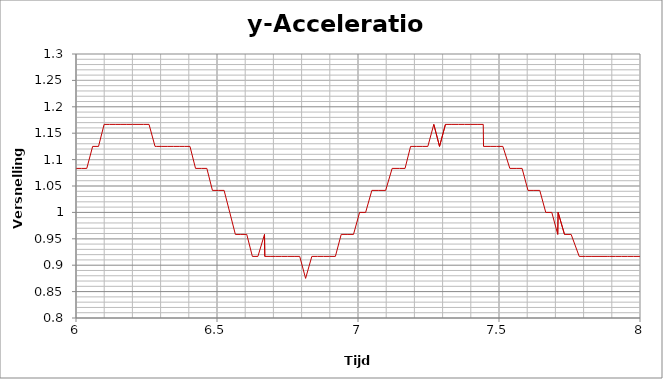
| Category |  y-Acceleration |
|---|---|
| 0.0002662 | 0.958 |
| 0.060613 | 0.958 |
| 0.0614756 | 0.958 |
| 0.0623199 | 0.958 |
| 0.0631661 | 0.958 |
| 0.0640148 | 0.958 |
| 0.0648724 | 0.958 |
| 0.0657192 | 0.958 |
| 0.0665637 | 0.958 |
| 0.0674161 | 0.958 |
| 0.0682692 | 0.958 |
| 0.0691174 | 0.958 |
| 0.0751866 | 0.958 |
| 0.0816187 | 1 |
| 0.1481199 | 0.958 |
| 0.1490641 | 0.958 |
| 0.150012 | 0.958 |
| 0.1508702 | 0.958 |
| 0.1517765 | 0.958 |
| 0.1526677 | 0.958 |
| 0.1760877 | 0.958 |
| 0.1770878 | 0.958 |
| 0.1782304 | 0.958 |
| 0.2018376 | 0.958 |
| 0.2028634 | 0.958 |
| 0.2271168 | 0.958 |
| 0.2281415 | 0.958 |
| 0.2370343 | 0.958 |
| 0.2382185 | 0.958 |
| 0.2612278 | 0.958 |
| 0.2621643 | 0.958 |
| 0.2864827 | 0.958 |
| 0.2874689 | 0.958 |
| 0.3031784 | 0.958 |
| 0.3038171 | 0.958 |
| 0.3189757 | 0.958 |
| 0.3196548 | 0.958 |
| 0.3350735 | 0.958 |
| 0.3363276 | 0.958 |
| 0.3520145 | 0.958 |
| 0.3672919 | 0.958 |
| 0.3679531 | 0.958 |
| 0.3822837 | 0.958 |
| 0.4009889 | 0.958 |
| 0.4160143 | 0.958 |
| 0.4166021 | 0.958 |
| 0.4320577 | 0.958 |
| 0.4475096 | 0.958 |
| 0.462454 | 0.958 |
| 0.4631152 | 0.958 |
| 0.4666822 | 0.958 |
| 0.4851773 | 0.958 |
| 0.4894834 | 0.958 |
| 0.5040216 | 0.958 |
| 0.5250323 | 1 |
| 0.5256603 | 1 |
| 0.5456363 | 0.958 |
| 0.5462364 | 0.958 |
| 0.5664823 | 1 |
| 0.5671653 | 1 |
| 0.5829726 | 0.958 |
| 0.5838985 | 0.958 |
| 0.6104471 | 0.958 |
| 0.6259898 | 0.958 |
| 0.6410219 | 0.958 |
| 0.6416885 | 0.958 |
| 0.6565502 | 0.958 |
| 0.6719764 | 0.958 |
| 0.6729011 | 0.958 |
| 0.6885319 | 0.958 |
| 0.7038648 | 0.958 |
| 0.7187812 | 1 |
| 0.7342729 | 0.958 |
| 0.7349506 | 0.958 |
| 0.7502098 | 0.958 |
| 0.7659669 | 0.958 |
| 0.7666024 | 0.958 |
| 0.8034565 | 0.958 |
| 0.8181654 | 1 |
| 0.8332226 | 0.958 |
| 0.8338515 | 0.958 |
| 0.8501524 | 0.958 |
| 0.8695783 | 0.958 |
| 0.8702673 | 0.958 |
| 0.9005879 | 1 |
| 0.9166332 | 0.958 |
| 0.9319072 | 0.958 |
| 0.9325106 | 0.958 |
| 0.9480411 | 0.958 |
| 0.9630584 | 0.958 |
| 0.9895187 | 0.958 |
| 1.006163 | 0.958 |
| 1.022612 | 0.958 |
| 1.03846 | 0.958 |
| 1.039092 | 0.958 |
| 1.054976 | 0.958 |
| 1.055839 | 0.958 |
| 1.071572 | 0.958 |
| 1.087707 | 1 |
| 1.088382 | 1 |
| 1.103901 | 1 |
| 1.119415 | 1.042 |
| 1.120099 | 1.042 |
| 1.136007 | 1 |
| 1.151418 | 1 |
| 1.177456 | 0.917 |
| 1.194921 | 0.875 |
| 1.195565 | 0.875 |
| 1.211279 | 0.833 |
| 1.211902 | 0.833 |
| 1.227909 | 1 |
| 1.228593 | 1 |
| 1.244789 | 1.125 |
| 1.261335 | 1.25 |
| 1.261897 | 1.25 |
| 1.276201 | 1.125 |
| 1.290843 | 0.875 |
| 1.291464 | 0.875 |
| 1.308035 | 0.833 |
| 1.323457 | 0.75 |
| 1.324118 | 0.75 |
| 1.33941 | 0.75 |
| 1.353974 | 0.75 |
| 1.369141 | 0.917 |
| 1.370163 | 0.917 |
| 1.385505 | 1.208 |
| 1.38608 | 1.208 |
| 1.404469 | 1.292 |
| 1.419612 | 1.333 |
| 1.420258 | 1.333 |
| 1.434877 | 1.25 |
| 1.450562 | 1.042 |
| 1.451181 | 1.042 |
| 1.466477 | 0.917 |
| 1.467086 | 0.917 |
| 1.482276 | 0.917 |
| 1.496969 | 0.917 |
| 1.497595 | 0.917 |
| 1.515008 | 0.958 |
| 1.530838 | 1.083 |
| 1.53149 | 1.083 |
| 1.557654 | 1.292 |
| 1.558419 | 1.292 |
| 1.558891 | 1.292 |
| 1.573972 | 1.292 |
| 1.589168 | 1.292 |
| 1.606048 | 1.25 |
| 1.606592 | 1.25 |
| 1.621485 | 1.208 |
| 1.6221 | 1.208 |
| 1.636641 | 1.167 |
| 1.651987 | 1.125 |
| 1.652547 | 1.125 |
| 1.667626 | 1.125 |
| 1.685046 | 1.208 |
| 1.686537 | 1.208 |
| 1.701227 | 1.333 |
| 1.701863 | 1.333 |
| 1.717252 | 1.333 |
| 1.733063 | 1.292 |
| 1.733733 | 1.292 |
| 1.748847 | 1.25 |
| 1.749599 | 1.208 |
| 1.764987 | 1.167 |
| 1.780498 | 1.083 |
| 1.781357 | 1.083 |
| 1.796076 | 1.083 |
| 1.810921 | 1.083 |
| 1.811683 | 1.083 |
| 1.827557 | 1.125 |
| 1.843878 | 1.208 |
| 1.84449 | 1.208 |
| 1.861412 | 1.25 |
| 1.879037 | 1.25 |
| 1.879667 | 1.25 |
| 1.894675 | 1.208 |
| 1.911403 | 1.167 |
| 1.911978 | 1.167 |
| 1.927106 | 1.167 |
| 1.927899 | 1.167 |
| 1.976432 | 1.042 |
| 1.977043 | 1.042 |
| 1.977532 | 1.042 |
| 1.978008 | 1.042 |
| 1.978498 | 1.042 |
| 1.992973 | 1.083 |
| 2.010069 | 1.125 |
| 2.010691 | 1.125 |
| 2.026174 | 1.125 |
| 2.026886 | 1.042 |
| 2.043105 | 1 |
| 2.059834 | 0.958 |
| 2.060908 | 0.958 |
| 2.075981 | 0.875 |
| 2.076623 | 0.875 |
| 2.091663 | 0.833 |
| 2.108044 | 0.833 |
| 2.108691 | 0.833 |
| 2.124262 | 0.833 |
| 2.143529 | 0.958 |
| 2.144132 | 0.958 |
| 2.158699 | 1 |
| 2.173671 | 1.042 |
| 2.174269 | 1.042 |
| 2.188814 | 1 |
| 2.205269 | 0.958 |
| 2.205843 | 0.958 |
| 2.221688 | 0.875 |
| 2.222244 | 0.875 |
| 2.237794 | 0.875 |
| 2.254113 | 0.792 |
| 2.254708 | 0.792 |
| 2.270574 | 0.833 |
| 2.286343 | 0.875 |
| 2.286921 | 0.875 |
| 2.302702 | 0.958 |
| 2.303376 | 0.958 |
| 2.319743 | 1 |
| 2.320693 | 1 |
| 2.33595 | 0.958 |
| 2.352243 | 0.917 |
| 2.35287 | 0.917 |
| 2.368848 | 0.917 |
| 2.385015 | 0.833 |
| 2.385627 | 0.833 |
| 2.40074 | 0.75 |
| 2.417503 | 0.75 |
| 2.418159 | 0.75 |
| 2.43529 | 0.833 |
| 2.435873 | 0.833 |
| 2.452403 | 0.917 |
| 2.468724 | 1.042 |
| 2.46929 | 1.042 |
| 2.486563 | 1.125 |
| 2.487219 | 1.125 |
| 2.502594 | 1.125 |
| 2.517827 | 1.083 |
| 2.518496 | 1.083 |
| 2.533627 | 1.042 |
| 2.550041 | 0.958 |
| 2.550731 | 0.958 |
| 2.566839 | 0.958 |
| 2.567503 | 0.958 |
| 2.582572 | 1 |
| 2.599814 | 1.083 |
| 2.600521 | 1.083 |
| 2.616426 | 1.125 |
| 2.6319 | 1.208 |
| 2.63258 | 1.208 |
| 2.648348 | 1.208 |
| 2.666164 | 1.167 |
| 2.666868 | 1.167 |
| 2.667571 | 1.125 |
| 2.683593 | 1.083 |
| 2.699468 | 1.042 |
| 2.700149 | 1.042 |
| 2.716404 | 1.042 |
| 2.732803 | 1.042 |
| 2.751235 | 1.125 |
| 2.751822 | 1.125 |
| 2.7525 | 1.167 |
| 2.769033 | 1.208 |
| 2.785805 | 1.292 |
| 2.786473 | 1.292 |
| 2.802499 | 1.333 |
| 2.818516 | 1.333 |
| 2.819093 | 1.333 |
| 2.872499 | 1.167 |
| 2.873155 | 1.167 |
| 2.873663 | 1.167 |
| 2.874172 | 1.167 |
| 2.874671 | 1.167 |
| 2.891077 | 1.167 |
| 2.891849 | 1.167 |
| 2.908446 | 1.208 |
| 2.909124 | 1.208 |
| 2.925903 | 1.25 |
| 2.926483 | 1.25 |
| 2.943396 | 1.208 |
| 2.943979 | 1.208 |
| 2.959762 | 1.208 |
| 2.975782 | 1.167 |
| 2.991867 | 1.083 |
| 2.992551 | 1.083 |
| 3.010469 | 1.083 |
| 3.025869 | 1.083 |
| 3.026557 | 1.083 |
| 3.042338 | 1.083 |
| 3.04301 | 1.083 |
| 3.058511 | 1.083 |
| 3.075442 | 1.167 |
| 3.076032 | 1.167 |
| 3.076734 | 1.167 |
| 3.09311 | 1.167 |
| 3.109627 | 1.125 |
| 3.110318 | 1.125 |
| 3.125886 | 1.083 |
| 3.141529 | 1.042 |
| 3.157346 | 1.042 |
| 3.158025 | 1.042 |
| 3.175215 | 0.958 |
| 3.175812 | 0.958 |
| 3.19338 | 0.958 |
| 3.195297 | 0.958 |
| 3.212076 | 0.958 |
| 3.212935 | 1 |
| 3.229846 | 1 |
| 3.230652 | 0.958 |
| 3.254457 | 0.958 |
| 3.270894 | 0.917 |
| 3.271729 | 0.917 |
| 3.272538 | 0.917 |
| 3.289592 | 0.917 |
| 3.290507 | 0.875 |
| 3.307485 | 0.875 |
| 3.324757 | 0.875 |
| 3.325544 | 0.875 |
| 3.342966 | 0.875 |
| 3.359819 | 0.917 |
| 3.361213 | 0.917 |
| 3.378363 | 0.917 |
| 3.379014 | 0.917 |
| 3.398633 | 0.917 |
| 3.417824 | 0.917 |
| 3.418486 | 0.917 |
| 3.419003 | 0.917 |
| 3.435381 | 0.875 |
| 3.435973 | 0.875 |
| 3.452818 | 0.875 |
| 3.469825 | 0.875 |
| 3.470546 | 0.875 |
| 3.487113 | 0.917 |
| 3.487815 | 0.917 |
| 3.505697 | 0.917 |
| 3.524318 | 0.917 |
| 3.525009 | 0.917 |
| 3.542207 | 0.875 |
| 3.542815 | 0.875 |
| 3.559146 | 0.875 |
| 3.561226 | 0.875 |
| 3.579415 | 0.875 |
| 3.596549 | 0.958 |
| 3.597263 | 0.958 |
| 3.614834 | 1 |
| 3.615488 | 1 |
| 3.616024 | 1 |
| 3.634102 | 1.042 |
| 3.651154 | 1.042 |
| 3.651788 | 1.042 |
| 3.67118 | 1.042 |
| 3.67205 | 1.042 |
| 3.691441 | 1.042 |
| 3.692117 | 1.042 |
| 3.716378 | 1.083 |
| 3.717102 | 1.083 |
| 3.717771 | 1.083 |
| 3.73671 | 1.083 |
| 3.754626 | 1.083 |
| 3.755738 | 1.083 |
| 3.77505 | 1.125 |
| 3.775661 | 1.125 |
| 3.793215 | 1.125 |
| 3.793836 | 1.125 |
| 3.811444 | 1.125 |
| 3.81208 | 1.125 |
| 3.82942 | 1.125 |
| 3.830263 | 1.125 |
| 3.848629 | 1.125 |
| 3.868261 | 1.167 |
| 3.868866 | 1.167 |
| 3.888633 | 1.167 |
| 3.889239 | 1.167 |
| 3.910725 | 1.208 |
| 3.911354 | 1.208 |
| 3.930367 | 1.25 |
| 3.931115 | 1.25 |
| 3.931696 | 1.25 |
| 3.94862 | 1.208 |
| 3.966797 | 1.208 |
| 3.967461 | 1.208 |
| 3.984741 | 1.208 |
| 4.001652 | 1.208 |
| 4.002263 | 1.208 |
| 4.021482 | 1.167 |
| 4.022092 | 1.167 |
| 4.039127 | 1.167 |
| 4.039734 | 1.167 |
| 4.056654 | 1.167 |
| 4.057257 | 1.167 |
| 4.074796 | 1.125 |
| 4.075412 | 1.125 |
| 4.094442 | 1.125 |
| 4.114367 | 1.125 |
| 4.114979 | 1.125 |
| 4.136014 | 1.125 |
| 4.136662 | 1.125 |
| 4.137188 | 1.125 |
| 4.157012 | 1.125 |
| 4.157799 | 1.125 |
| 4.180805 | 1.125 |
| 4.199557 | 1.083 |
| 4.200227 | 1.083 |
| 4.200783 | 1.083 |
| 4.219336 | 1.083 |
| 4.220038 | 1.083 |
| 4.238477 | 1.083 |
| 4.239399 | 1.083 |
| 4.255874 | 1.083 |
| 4.273692 | 1.042 |
| 4.275841 | 1.042 |
| 4.294923 | 1 |
| 4.295534 | 1 |
| 4.312841 | 0.958 |
| 4.333052 | 0.958 |
| 4.333668 | 0.958 |
| 4.334204 | 0.958 |
| 4.35188 | 0.917 |
| 4.352506 | 0.917 |
| 4.370719 | 0.917 |
| 4.39007 | 0.917 |
| 4.390913 | 0.958 |
| 4.391473 | 0.958 |
| 4.411549 | 0.917 |
| 4.432093 | 0.917 |
| 4.432872 | 0.917 |
| 4.450951 | 0.917 |
| 4.451829 | 0.917 |
| 4.452538 | 0.917 |
| 4.471237 | 0.917 |
| 4.488688 | 0.875 |
| 4.489323 | 0.875 |
| 4.50632 | 0.917 |
| 4.507215 | 0.875 |
| 4.52534 | 0.917 |
| 4.526058 | 0.917 |
| 4.545467 | 0.875 |
| 4.562277 | 0.917 |
| 4.562996 | 0.917 |
| 4.580622 | 0.917 |
| 4.58131 | 0.917 |
| 4.600426 | 0.917 |
| 4.618572 | 0.875 |
| 4.619329 | 0.875 |
| 4.638745 | 0.875 |
| 4.657476 | 0.917 |
| 4.658124 | 0.917 |
| 4.677011 | 0.917 |
| 4.677647 | 0.917 |
| 4.695756 | 0.958 |
| 4.696397 | 0.958 |
| 4.714896 | 1 |
| 4.715533 | 1 |
| 4.733857 | 1 |
| 4.734567 | 1 |
| 4.753572 | 1.042 |
| 4.754201 | 1.042 |
| 4.773886 | 1 |
| 4.774528 | 1 |
| 4.793826 | 1.042 |
| 4.794457 | 1.042 |
| 4.81465 | 1.042 |
| 4.815291 | 1.042 |
| 4.834771 | 1.042 |
| 4.835478 | 1.042 |
| 4.855644 | 1.042 |
| 4.856471 | 1.042 |
| 4.875498 | 1.083 |
| 4.87616 | 1.083 |
| 4.893731 | 1.083 |
| 4.894454 | 1.083 |
| 4.91176 | 1.083 |
| 4.930867 | 1.125 |
| 4.931514 | 1.125 |
| 4.949513 | 1.125 |
| 4.950244 | 1.125 |
| 4.968587 | 1.167 |
| 4.96931 | 1.167 |
| 4.987575 | 1.167 |
| 4.98828 | 1.167 |
| 5.007565 | 1.208 |
| 5.008242 | 1.208 |
| 5.028056 | 1.208 |
| 5.028913 | 1.208 |
| 5.04611 | 1.208 |
| 5.064214 | 1.208 |
| 5.064933 | 1.208 |
| 5.082254 | 1.167 |
| 5.082932 | 1.167 |
| 5.100035 | 1.167 |
| 5.10078 | 1.167 |
| 5.118546 | 1.125 |
| 5.119197 | 1.125 |
| 5.138031 | 1.167 |
| 5.138741 | 1.167 |
| 5.158171 | 1.125 |
| 5.177094 | 1.125 |
| 5.17777 | 1.125 |
| 5.196535 | 1.125 |
| 5.197258 | 1.125 |
| 5.214845 | 1.167 |
| 5.215663 | 1.167 |
| 5.234885 | 1.125 |
| 5.23557 | 1.125 |
| 5.255137 | 1.125 |
| 5.255782 | 1.125 |
| 5.275614 | 1.125 |
| 5.27629 | 1.125 |
| 5.297902 | 1.083 |
| 5.29855 | 1.083 |
| 5.318673 | 1.083 |
| 5.319317 | 1.083 |
| 5.341199 | 1.083 |
| 5.341964 | 1.042 |
| 5.342524 | 1.042 |
| 5.362966 | 1.042 |
| 5.384017 | 1.042 |
| 5.384674 | 1.042 |
| 5.385231 | 1.042 |
| 5.405904 | 0.958 |
| 5.406559 | 0.958 |
| 5.427012 | 1 |
| 5.427732 | 1 |
| 5.445395 | 0.958 |
| 5.446513 | 0.958 |
| 5.463916 | 0.958 |
| 5.481521 | 0.958 |
| 5.482263 | 0.958 |
| 5.499962 | 0.958 |
| 5.500607 | 0.958 |
| 5.521568 | 0.958 |
| 5.522213 | 0.958 |
| 5.542115 | 0.917 |
| 5.542764 | 0.917 |
| 5.564919 | 0.917 |
| 5.565678 | 0.917 |
| 5.566242 | 0.917 |
| 5.586475 | 0.917 |
| 5.606754 | 0.917 |
| 5.607428 | 0.917 |
| 5.626393 | 0.917 |
| 5.627048 | 0.917 |
| 5.62792 | 0.917 |
| 5.649092 | 0.917 |
| 5.677835 | 0.875 |
| 5.678818 | 0.875 |
| 5.679666 | 0.875 |
| 5.697974 | 0.917 |
| 5.698693 | 0.917 |
| 5.716976 | 0.875 |
| 5.717714 | 0.875 |
| 5.736117 | 0.917 |
| 5.736897 | 0.917 |
| 5.755868 | 0.917 |
| 5.756614 | 0.917 |
| 5.775803 | 0.958 |
| 5.776739 | 0.958 |
| 5.795527 | 0.958 |
| 5.796308 | 0.958 |
| 5.81497 | 0.958 |
| 5.815629 | 0.958 |
| 5.835294 | 0.958 |
| 5.835983 | 0.958 |
| 5.870345 | 0.958 |
| 5.871287 | 0.958 |
| 5.871933 | 1 |
| 5.872715 | 1 |
| 5.89613 | 1 |
| 5.89692 | 1 |
| 5.916994 | 1 |
| 5.918079 | 1 |
| 5.937619 | 1.042 |
| 5.938279 | 1.042 |
| 5.95926 | 1.042 |
| 5.959964 | 1.042 |
| 5.980758 | 1.042 |
| 5.981452 | 1.042 |
| 5.999629 | 1.083 |
| 6.000379 | 1.083 |
| 6.018971 | 1.083 |
| 6.020279 | 1.083 |
| 6.038286 | 1.083 |
| 6.039063 | 1.083 |
| 6.059027 | 1.125 |
| 6.059917 | 1.125 |
| 6.079843 | 1.125 |
| 6.0806 | 1.125 |
| 6.099723 | 1.167 |
| 6.100475 | 1.167 |
| 6.119243 | 1.167 |
| 6.120039 | 1.167 |
| 6.139014 | 1.167 |
| 6.139864 | 1.167 |
| 6.159259 | 1.167 |
| 6.15992 | 1.167 |
| 6.180265 | 1.167 |
| 6.180959 | 1.167 |
| 6.200109 | 1.167 |
| 6.219884 | 1.167 |
| 6.22059 | 1.167 |
| 6.239026 | 1.167 |
| 6.259012 | 1.167 |
| 6.280241 | 1.125 |
| 6.280997 | 1.125 |
| 6.284644 | 1.125 |
| 6.304255 | 1.125 |
| 6.306303 | 1.125 |
| 6.325403 | 1.125 |
| 6.326072 | 1.125 |
| 6.346319 | 1.125 |
| 6.347612 | 1.125 |
| 6.366124 | 1.125 |
| 6.366875 | 1.125 |
| 6.385231 | 1.125 |
| 6.38599 | 1.125 |
| 6.40419 | 1.125 |
| 6.423825 | 1.083 |
| 6.424738 | 1.083 |
| 6.425336 | 1.083 |
| 6.444478 | 1.083 |
| 6.445549 | 1.083 |
| 6.464008 | 1.083 |
| 6.483772 | 1.042 |
| 6.48448 | 1.042 |
| 6.504388 | 1.042 |
| 6.505153 | 1.042 |
| 6.505746 | 1.042 |
| 6.525165 | 1.042 |
| 6.545268 | 1 |
| 6.546043 | 1 |
| 6.546627 | 1 |
| 6.565144 | 0.958 |
| 6.584456 | 0.958 |
| 6.585169 | 0.958 |
| 6.605523 | 0.958 |
| 6.606302 | 0.958 |
| 6.606977 | 0.958 |
| 6.625432 | 0.917 |
| 6.645076 | 0.917 |
| 6.646483 | 0.917 |
| 6.647084 | 0.917 |
| 6.668478 | 0.958 |
| 6.669513 | 0.917 |
| 6.688247 | 0.917 |
| 6.708448 | 0.917 |
| 6.709533 | 0.917 |
| 6.710251 | 0.917 |
| 6.729266 | 0.917 |
| 6.750484 | 0.917 |
| 6.751229 | 0.917 |
| 6.75182 | 0.917 |
| 6.773431 | 0.917 |
| 6.774105 | 0.917 |
| 6.793341 | 0.917 |
| 6.814166 | 0.875 |
| 6.815402 | 0.875 |
| 6.816128 | 0.875 |
| 6.836314 | 0.917 |
| 6.837007 | 0.917 |
| 6.856794 | 0.917 |
| 6.857612 | 0.917 |
| 6.877659 | 0.917 |
| 6.878879 | 0.917 |
| 6.898581 | 0.917 |
| 6.899358 | 0.917 |
| 6.919789 | 0.917 |
| 6.920567 | 0.917 |
| 6.940457 | 0.958 |
| 6.941144 | 0.958 |
| 6.961349 | 0.958 |
| 6.962128 | 0.958 |
| 6.984097 | 0.958 |
| 6.984905 | 0.958 |
| 6.985513 | 0.958 |
| 7.005632 | 1 |
| 7.006435 | 1 |
| 7.02705 | 1 |
| 7.049135 | 1.042 |
| 7.049828 | 1.042 |
| 7.050424 | 1.042 |
| 7.073669 | 1.042 |
| 7.074385 | 1.042 |
| 7.098041 | 1.042 |
| 7.098892 | 1.042 |
| 7.099532 | 1.042 |
| 7.121077 | 1.083 |
| 7.122627 | 1.083 |
| 7.146601 | 1.083 |
| 7.147666 | 1.083 |
| 7.166885 | 1.083 |
| 7.167658 | 1.083 |
| 7.186472 | 1.125 |
| 7.187257 | 1.125 |
| 7.206549 | 1.125 |
| 7.207531 | 1.125 |
| 7.208168 | 1.125 |
| 7.227958 | 1.125 |
| 7.247718 | 1.125 |
| 7.248511 | 1.125 |
| 7.268793 | 1.167 |
| 7.269585 | 1.167 |
| 7.289125 | 1.125 |
| 7.2899 | 1.125 |
| 7.310102 | 1.167 |
| 7.311285 | 1.167 |
| 7.311884 | 1.167 |
| 7.333024 | 1.167 |
| 7.33372 | 1.167 |
| 7.356527 | 1.167 |
| 7.357221 | 1.167 |
| 7.377576 | 1.167 |
| 7.378298 | 1.167 |
| 7.400278 | 1.167 |
| 7.40097 | 1.167 |
| 7.422299 | 1.167 |
| 7.423128 | 1.167 |
| 7.444147 | 1.167 |
| 7.445107 | 1.125 |
| 7.445715 | 1.125 |
| 7.471079 | 1.125 |
| 7.472188 | 1.125 |
| 7.491728 | 1.125 |
| 7.492427 | 1.125 |
| 7.51371 | 1.125 |
| 7.514395 | 1.125 |
| 7.538404 | 1.083 |
| 7.539196 | 1.083 |
| 7.540057 | 1.083 |
| 7.560894 | 1.083 |
| 7.561934 | 1.083 |
| 7.581856 | 1.083 |
| 7.582654 | 1.083 |
| 7.602819 | 1.042 |
| 7.603755 | 1.042 |
| 7.623708 | 1.042 |
| 7.624461 | 1.042 |
| 7.644605 | 1.042 |
| 7.645391 | 1.042 |
| 7.665795 | 1 |
| 7.666569 | 1 |
| 7.687225 | 1 |
| 7.68801 | 1 |
| 7.708309 | 0.958 |
| 7.709623 | 1 |
| 7.710277 | 1 |
| 7.732236 | 0.958 |
| 7.732947 | 0.958 |
| 7.755853 | 0.958 |
| 7.756855 | 0.958 |
| 7.784441 | 0.917 |
| 7.785135 | 0.917 |
| 7.785745 | 0.917 |
| 7.807374 | 0.917 |
| 7.808119 | 0.917 |
| 7.829374 | 0.917 |
| 7.8301 | 0.917 |
| 7.885962 | 0.917 |
| 7.886787 | 0.917 |
| 7.887866 | 0.917 |
| 7.888498 | 0.917 |
| 7.890811 | 0.917 |
| 7.891554 | 0.917 |
| 7.912533 | 0.917 |
| 7.913322 | 0.917 |
| 7.934786 | 0.917 |
| 7.935487 | 0.917 |
| 7.936534 | 0.917 |
| 7.956103 | 0.917 |
| 7.956913 | 0.917 |
| 7.977138 | 0.917 |
| 7.977895 | 0.917 |
| 7.999568 | 0.917 |
| 8.000631 | 0.917 |
| 8.021871 | 0.917 |
| 8.022669 | 0.917 |
| 8.04732 | 0.917 |
| 8.048056 | 0.917 |
| 8.049393 | 0.958 |
| 8.071186 | 0.958 |
| 8.071987 | 0.958 |
| 8.094712 | 0.958 |
| 8.095501 | 0.958 |
| 8.11738 | 0.958 |
| 8.118165 | 0.958 |
| 8.139174 | 0.958 |
| 8.139953 | 0.958 |
| 8.161718 | 1.042 |
| 8.162643 | 1.042 |
| 8.16342 | 1.042 |
| 8.185024 | 1.042 |
| 8.185923 | 1.042 |
| 8.207445 | 1.042 |
| 8.208185 | 1.042 |
| 8.231238 | 1.083 |
| 8.232403 | 1.083 |
| 8.253819 | 1.083 |
| 8.25456 | 1.083 |
| 8.255192 | 1.083 |
| 8.276242 | 1.083 |
| 8.276952 | 1.083 |
| 8.298633 | 1.083 |
| 8.299353 | 1.083 |
| 8.324159 | 1.125 |
| 8.324873 | 1.125 |
| 8.325693 | 1.125 |
| 8.347527 | 1.125 |
| 8.348271 | 1.125 |
| 8.369528 | 1.125 |
| 8.370293 | 1.125 |
| 8.390472 | 1.125 |
| 8.391416 | 1.125 |
| 8.412967 | 1.125 |
| 8.413673 | 1.125 |
| 8.433715 | 1.125 |
| 8.434787 | 1.125 |
| 8.437051 | 1.125 |
| 8.462811 | 1.167 |
| 8.46361 | 1.167 |
| 8.485007 | 1.167 |
| 8.486055 | 1.167 |
| 8.486814 | 1.167 |
| 8.508143 | 1.125 |
| 8.509168 | 1.125 |
| 8.532919 | 1.167 |
| 8.533817 | 1.167 |
| 8.558428 | 1.125 |
| 8.559581 | 1.125 |
| 8.560279 | 1.125 |
| 8.596471 | 1.042 |
| 8.617346 | 1.125 |
| 8.618067 | 1.125 |
| 8.638792 | 1.083 |
| 8.639555 | 1.083 |
| 8.661494 | 1.083 |
| 8.662512 | 1.083 |
| 8.663292 | 1.083 |
| 8.683562 | 1.083 |
| 8.70429 | 1.042 |
| 8.705548 | 1.042 |
| 8.706238 | 1.042 |
| 8.727002 | 1.042 |
| 8.727803 | 1.042 |
| 8.74782 | 1.042 |
| 8.749043 | 1.042 |
| 8.750095 | 1.042 |
| 8.770535 | 1.042 |
| 8.771354 | 1.042 |
| 8.794538 | 1 |
| 8.795478 | 1 |
| 8.81579 | 1 |
| 8.816601 | 1 |
| 8.836979 | 0.958 |
| 8.837807 | 0.958 |
| 8.86964 | 0.958 |
| 8.872331 | 0.958 |
| 8.873107 | 0.958 |
| 8.874109 | 0.958 |
| 8.895744 | 0.958 |
| 8.896482 | 0.958 |
| 8.917588 | 0.917 |
| 8.918415 | 0.917 |
| 8.939026 | 0.917 |
| 8.939827 | 0.917 |
| 8.960737 | 0.917 |
| 8.961536 | 0.917 |
| 8.982053 | 0.917 |
| 8.982788 | 0.917 |
| 9.004328 | 0.917 |
| 9.005162 | 0.917 |
| 9.027522 | 0.917 |
| 9.028487 | 0.917 |
| 9.029341 | 0.917 |
| 9.049835 | 0.917 |
| 9.050677 | 0.917 |
| 9.070789 | 0.917 |
| 9.071731 | 0.917 |
| 9.093394 | 0.917 |
| 9.094188 | 0.917 |
| 9.116899 | 0.917 |
| 9.117755 | 0.917 |
| 9.138708 | 0.917 |
| 9.139503 | 0.917 |
| 9.140158 | 0.917 |
| 9.164969 | 0.917 |
| 9.1658 | 0.917 |
| 9.188004 | 0.958 |
| 9.188793 | 0.958 |
| 9.210587 | 0.958 |
| 9.211436 | 0.958 |
| 9.231823 | 0.958 |
| 9.232602 | 0.958 |
| 9.233663 | 0.958 |
| 9.255376 | 1 |
| 9.256204 | 1 |
| 9.278633 | 1 |
| 9.279526 | 1 |
| 9.2802 | 1 |
| 9.301999 | 1 |
| 9.323968 | 1.042 |
| 9.324794 | 1.042 |
| 9.346464 | 1.042 |
| 9.34721 | 1.042 |
| 9.347887 | 1.042 |
| 9.370941 | 1.083 |
| 9.371817 | 1.083 |
| 9.394179 | 1.083 |
| 9.394928 | 1.083 |
| 9.395831 | 1.083 |
| 9.417532 | 1.083 |
| 9.41828 | 1.083 |
| 9.441015 | 1.125 |
| 9.441843 | 1.125 |
| 9.46322 | 1.083 |
| 9.463996 | 1.083 |
| 9.464856 | 1.125 |
| 9.48578 | 1.125 |
| 9.486633 | 1.125 |
| 9.507387 | 1.125 |
| 9.508221 | 1.125 |
| 9.529787 | 1.125 |
| 9.53064 | 1.125 |
| 9.551209 | 1.125 |
| 9.552012 | 1.125 |
| 9.57279 | 1.167 |
| 9.573612 | 1.167 |
| 9.596124 | 1.167 |
| 9.617097 | 1.125 |
| 9.617954 | 1.125 |
| 9.618608 | 1.125 |
| 9.639037 | 1.125 |
| 9.660612 | 1.125 |
| 9.661533 | 1.125 |
| 9.662214 | 1.125 |
| 9.685854 | 1.125 |
| 9.686872 | 1.125 |
| 9.687526 | 1.125 |
| 9.709648 | 1.125 |
| 9.710433 | 1.125 |
| 9.734171 | 1.125 |
| 9.734991 | 1.125 |
| 9.756536 | 1.125 |
| 9.757367 | 1.125 |
| 9.75803 | 1.125 |
| 9.780823 | 1.083 |
| 9.781761 | 1.083 |
| 9.805958 | 1.083 |
| 9.806767 | 1.083 |
| 9.830286 | 1.083 |
| 9.831151 | 1.083 |
| 9.831808 | 1.083 |
| 9.854147 | 1.042 |
| 9.854944 | 1.042 |
| 9.878014 | 1.042 |
| 9.878857 | 1.042 |
| 9.9006 | 1 |
| 9.901487 | 1 |
| 9.902151 | 1 |
| 9.925031 | 1 |
| 9.925792 | 1 |
| 9.948843 | 0.958 |
| 9.949685 | 0.958 |
| 9.973735 | 0.958 |
| 9.974487 | 0.958 |
| 9.975165 | 0.958 |
| 9.998309 | 0.958 |
| 9.999061 | 0.958 |
| 10.02162 | 0.958 |
| 10.02275 | 0.958 |
| 10.04467 | 0.917 |
| 10.04547 | 0.917 |
| 10.0463 | 0.917 |
| 10.06875 | 0.958 |
| 10.06959 | 0.958 |
| 10.09383 | 0.917 |
| 10.09478 | 0.917 |
| 10.1302 | 0.917 |
| 10.1311 | 0.917 |
| 10.1318 | 0.917 |
| 10.1328 | 0.917 |
| 10.15464 | 0.917 |
| 10.1555 | 0.917 |
| 10.17808 | 0.917 |
| 10.17894 | 0.917 |
| 10.17963 | 0.917 |
| 10.20139 | 0.917 |
| 10.20226 | 0.917 |
| 10.22445 | 0.917 |
| 10.22531 | 0.917 |
| 10.24746 | 0.917 |
| 10.24831 | 0.917 |
| 10.27065 | 0.917 |
| 10.27142 | 0.917 |
| 10.27211 | 0.917 |
| 10.29476 | 0.958 |
| 10.29652 | 0.958 |
| 10.31812 | 0.958 |
| 10.31896 | 0.958 |
| 10.31964 | 0.958 |
| 10.34254 | 0.958 |
| 10.34381 | 0.958 |
| 10.36929 | 1 |
| 10.37016 | 1 |
| 10.37102 | 1 |
| 10.39453 | 1 |
| 10.39558 | 1 |
| 10.4178 | 1 |
| 10.41864 | 1 |
| 10.4194 | 1 |
| 10.44196 | 1.042 |
| 10.44282 | 1.042 |
| 10.46648 | 1.042 |
| 10.46724 | 1.042 |
| 10.49006 | 1.042 |
| 10.49097 | 1.042 |
| 10.49168 | 1.042 |
| 10.51567 | 1.083 |
| 10.51657 | 1.083 |
| 10.53845 | 1.083 |
| 10.53929 | 1.083 |
| 10.56157 | 1.083 |
| 10.5839 | 1.125 |
| 10.58465 | 1.125 |
| 10.58576 | 1.125 |
| 10.60756 | 1.125 |
| 10.60845 | 1.125 |
| 10.63068 | 1.125 |
| 10.63152 | 1.125 |
| 10.65544 | 1.125 |
| 10.65622 | 1.125 |
| 10.6798 | 1.125 |
| 10.68064 | 1.125 |
| 10.68141 | 1.125 |
| 10.70385 | 1.167 |
| 10.70468 | 1.167 |
| 10.7272 | 1.125 |
| 10.72802 | 1.125 |
| 10.7287 | 1.125 |
| 10.75133 | 1.125 |
| 10.75209 | 1.125 |
| 10.77593 | 1.125 |
| 10.77812 | 1.125 |
| 10.77922 | 1.125 |
| 10.80087 | 1.125 |
| 10.80174 | 1.125 |
| 10.8236 | 1.125 |
| 10.82446 | 1.125 |
| 10.84584 | 1.125 |
| 10.84671 | 1.125 |
| 10.88347 | 1.125 |
| 10.90609 | 1.083 |
| 10.90695 | 1.083 |
| 10.93135 | 1.083 |
| 10.9322 | 1.083 |
| 10.93288 | 1.083 |
| 10.9542 | 1.042 |
| 10.95508 | 1.042 |
| 10.97872 | 1.042 |
| 10.97957 | 1.042 |
| 11.00163 | 1.042 |
| 11.00245 | 1.042 |
| 11.02609 | 1.042 |
| 11.02738 | 1.042 |
| 11.02806 | 1.042 |
| 11.05161 | 1 |
| 11.05238 | 1 |
| 11.07477 | 1 |
| 11.07563 | 1 |
| 11.07638 | 1 |
| 11.10005 | 0.958 |
| 11.10093 | 0.958 |
| 11.12378 | 0.958 |
| 11.12483 | 0.958 |
| 11.12573 | 0.958 |
| 11.14949 | 0.958 |
| 11.15034 | 0.958 |
| 11.17285 | 0.958 |
| 11.17389 | 0.958 |
| 11.17459 | 0.958 |
| 11.19696 | 0.958 |
| 11.19773 | 0.958 |
| 11.22547 | 0.917 |
| 11.24738 | 0.917 |
| 11.24826 | 0.917 |
| 11.26991 | 0.917 |
| 11.27078 | 0.917 |
| 11.29466 | 0.917 |
| 11.29569 | 0.917 |
| 11.29639 | 0.917 |
| 11.32003 | 0.917 |
| 11.32089 | 0.917 |
| 11.3437 | 0.917 |
| 11.34463 | 0.917 |
| 11.36715 | 0.917 |
| 11.36791 | 0.917 |
| 11.36863 | 0.917 |
| 11.39259 | 0.917 |
| 11.39336 | 0.917 |
| 11.41613 | 0.958 |
| 11.417 | 0.958 |
| 11.44093 | 0.958 |
| 11.44183 | 0.958 |
| 11.44264 | 0.958 |
| 11.46523 | 0.958 |
| 11.4661 | 0.958 |
| 11.48918 | 0.958 |
| 11.49016 | 0.958 |
| 11.49142 | 0.958 |
| 11.514 | 1 |
| 11.5148 | 1 |
| 11.53808 | 1.042 |
| 11.53932 | 1.042 |
| 11.56197 | 1 |
| 11.56298 | 1 |
| 11.58626 | 1.042 |
| 11.58715 | 1.042 |
| 11.58784 | 1.042 |
| 11.61015 | 1.042 |
| 11.61103 | 1.042 |
| 11.63386 | 1.083 |
| 11.63475 | 1.083 |
| 11.63723 | 1.083 |
| 11.65983 | 1.083 |
| 11.66071 | 1.083 |
| 11.68307 | 1.083 |
| 11.68432 | 1.083 |
| 11.70692 | 1.083 |
| 11.7078 | 1.083 |
| 11.7085 | 1.083 |
| 11.73211 | 1.125 |
| 11.73295 | 1.125 |
| 11.75604 | 1.125 |
| 11.75701 | 1.125 |
| 11.75771 | 1.125 |
| 11.78159 | 1.125 |
| 11.7824 | 1.125 |
| 11.80752 | 1.125 |
| 11.80839 | 1.125 |
| 11.8091 | 1.125 |
| 11.83235 | 1.125 |
| 11.83323 | 1.125 |
| 11.87057 | 1.125 |
| 11.87234 | 1.125 |
| 11.89507 | 1.125 |
| 11.8959 | 1.125 |
| 11.91907 | 1.125 |
| 11.92004 | 1.125 |
| 11.92091 | 1.125 |
| 11.94427 | 1.125 |
| 11.94517 | 1.125 |
| 11.96799 | 1.083 |
| 11.96888 | 1.083 |
| 11.99232 | 1.125 |
| 11.99344 | 1.083 |
| 12.01854 | 1.083 |
| 12.01933 | 1.083 |
| 12.04325 | 1.083 |
| 12.04415 | 1.083 |
| 12.04494 | 1.083 |
| 12.06804 | 1.042 |
| 12.06892 | 1.042 |
| 12.0709 | 1.083 |
| 12.09438 | 1.042 |
| 12.09529 | 1.042 |
| 12.11804 | 1.042 |
| 12.11915 | 1.042 |
| 12.14254 | 1 |
| 12.14342 | 1 |
| 12.16817 | 1 |
| 12.16908 | 1 |
| 12.16979 | 1 |
| 12.1924 | 1 |
| 12.19319 | 1 |
| 12.21745 | 0.958 |
| 12.21824 | 0.958 |
| 12.21898 | 0.958 |
| 12.24308 | 0.958 |
| 12.24387 | 0.958 |
| 12.26746 | 0.958 |
| 12.2684 | 0.958 |
| 12.29109 | 0.917 |
| 12.2921 | 0.917 |
| 12.29281 | 0.917 |
| 12.31783 | 0.917 |
| 12.31867 | 0.917 |
| 12.31942 | 0.917 |
| 12.34308 | 0.917 |
| 12.34397 | 0.917 |
| 12.36868 | 0.917 |
| 12.36994 | 0.917 |
| 12.37065 | 0.917 |
| 12.39586 | 0.917 |
| 12.39669 | 0.917 |
| 12.4215 | 0.917 |
| 12.42257 | 0.917 |
| 12.42362 | 0.917 |
| 12.4469 | 0.917 |
| 12.44782 | 0.917 |
| 12.47221 | 0.917 |
| 12.47314 | 0.917 |
| 12.47386 | 0.917 |
| 12.49745 | 0.958 |
| 12.49963 | 0.958 |
| 12.52362 | 0.958 |
| 12.5245 | 0.958 |
| 12.52521 | 0.958 |
| 12.54932 | 0.958 |
| 12.5502 | 0.958 |
| 12.57421 | 0.958 |
| 12.57516 | 0.958 |
| 12.57588 | 0.958 |
| 12.61197 | 0.958 |
| 12.61284 | 0.958 |
| 12.61358 | 0.958 |
| 12.63784 | 1 |
| 12.63903 | 1 |
| 12.63974 | 1 |
| 12.66575 | 1.042 |
| 12.66661 | 1.042 |
| 12.66774 | 1.042 |
| 12.69105 | 1.042 |
| 12.69197 | 1.042 |
| 12.7164 | 1.042 |
| 12.71727 | 1.042 |
| 12.74104 | 1.042 |
| 12.74196 | 1.042 |
| 12.7427 | 1.042 |
| 12.76621 | 1.042 |
| 12.76742 | 1.042 |
| 12.76842 | 1.083 |
| 12.79302 | 1.083 |
| 12.79394 | 1.083 |
| 12.81795 | 1.083 |
| 12.81886 | 1.083 |
| 12.81962 | 1.083 |
| 12.84282 | 1.083 |
| 12.84374 | 1.083 |
| 12.87274 | 1.125 |
| 12.8736 | 1.125 |
| 12.87432 | 1.125 |
| 12.89711 | 1.125 |
| 12.89802 | 1.125 |
| 12.92077 | 1.125 |
| 12.92188 | 1.125 |
| 12.9226 | 1.125 |
| 12.94682 | 1.125 |
| 12.94816 | 1.125 |
| 12.9726 | 1.125 |
| 12.9739 | 1.125 |
| 12.97496 | 1.125 |
| 12.99879 | 1.125 |
| 12.99965 | 1.125 |
| 13.02264 | 1.125 |
| 13.02356 | 1.125 |
| 13.02439 | 1.125 |
| 13.04859 | 1.125 |
| 13.04953 | 1.125 |
| 13.07306 | 1.083 |
| 13.07427 | 1.083 |
| 13.09934 | 1.083 |
| 13.10023 | 1.083 |
| 13.10099 | 1.083 |
| 13.12546 | 1.083 |
| 13.12637 | 1.083 |
| 13.12711 | 1.083 |
| 13.15221 | 1.042 |
| 13.15313 | 1.042 |
| 13.17655 | 1.083 |
| 13.17748 | 1.083 |
| 13.17823 | 1.083 |
| 13.20243 | 1.042 |
| 13.20336 | 1.042 |
| 13.22873 | 1.042 |
| 13.22979 | 1.042 |
| 13.23057 | 1.042 |
| 13.25466 | 1 |
| 13.25553 | 1 |
| 13.28009 | 1 |
| 13.28102 | 1 |
| 13.28346 | 1 |
| 13.30764 | 0.958 |
| 13.30904 | 0.958 |
| 13.30996 | 0.958 |
| 13.33391 | 0.958 |
| 13.33482 | 0.958 |
| 13.35882 | 0.958 |
| 13.35975 | 0.958 |
| 13.36049 | 0.958 |
| 13.38518 | 0.958 |
| 13.38604 | 0.958 |
| 13.41064 | 0.958 |
| 13.41162 | 0.958 |
| 13.43634 | 0.917 |
| 13.43722 | 0.917 |
| 13.43796 | 0.917 |
| 13.46212 | 0.917 |
| 13.46294 | 0.917 |
| 13.48786 | 0.917 |
| 13.48878 | 0.917 |
| 13.48951 | 0.917 |
| 13.51484 | 0.917 |
| 13.51578 | 0.917 |
| 13.53975 | 0.917 |
| 13.54066 | 0.917 |
| 13.5414 | 0.917 |
| 13.56496 | 0.917 |
| 13.58931 | 0.917 |
| 13.59026 | 0.917 |
| 13.61448 | 0.958 |
| 13.61601 | 0.917 |
| 13.61676 | 0.917 |
| 13.61749 | 0.917 |
| 13.6433 | 0.958 |
| 13.64429 | 0.958 |
| 13.66864 | 0.958 |
| 13.66953 | 0.958 |
| 13.69375 | 0.958 |
| 13.69478 | 0.958 |
| 13.69553 | 0.958 |
| 13.69629 | 0.958 |
| 13.72095 | 0.958 |
| 13.7218 | 0.958 |
| 13.74602 | 1 |
| 13.74695 | 1 |
| 13.77249 | 1 |
| 13.77344 | 1 |
| 13.77418 | 1 |
| 13.79865 | 1 |
| 13.79955 | 1 |
| 13.80074 | 1.042 |
| 13.82442 | 1.042 |
| 13.82535 | 1.042 |
| 13.8507 | 1.042 |
| 13.85183 | 1.042 |
| 13.85257 | 1.042 |
| 13.87828 | 1.042 |
| 13.87935 | 1.042 |
| 13.90494 | 1.083 |
| 13.90591 | 1.083 |
| 13.90666 | 1.083 |
| 13.93159 | 1.083 |
| 13.93257 | 1.083 |
| 13.93332 | 1.083 |
| 13.95717 | 1.083 |
| 13.95812 | 1.083 |
| 13.98211 | 1.083 |
| 13.98302 | 1.083 |
| 14.00765 | 1.125 |
| 14.00858 | 1.125 |
| 14.00933 | 1.125 |
| 14.03381 | 1.125 |
| 14.03496 | 1.125 |
| 14.03597 | 1.125 |
| 14.061 | 1.125 |
| 14.06184 | 1.125 |
| 14.08798 | 1.125 |
| 14.08894 | 1.125 |
| 14.0899 | 1.125 |
| 14.11453 | 1.125 |
| 14.11548 | 1.125 |
| 14.11623 | 1.125 |
| 14.14046 | 1.125 |
| 14.14288 | 1.125 |
| 14.17117 | 1.083 |
| 14.1721 | 1.083 |
| 14.17286 | 1.083 |
| 14.19841 | 1.083 |
| 14.19937 | 1.083 |
| 14.22654 | 1.083 |
| 14.22749 | 1.083 |
| 14.25356 | 1.083 |
| 14.25447 | 1.083 |
| 14.25525 | 1.083 |
| 14.256 | 1.083 |
| 14.25683 | 1.083 |
| 14.28191 | 1.042 |
| 14.28281 | 1.042 |
| 14.30956 | 1.042 |
| 14.31053 | 1.042 |
| 14.3115 | 1.042 |
| 14.33706 | 1.042 |
| 14.33801 | 1.042 |
| 14.36194 | 1 |
| 14.36292 | 1 |
| 14.36367 | 1 |
| 14.38944 | 1 |
| 14.39039 | 1 |
| 14.41501 | 1 |
| 14.41597 | 1 |
| 14.41672 | 1 |
| 14.4423 | 0.958 |
| 14.44326 | 0.958 |
| 14.44401 | 0.958 |
| 14.46928 | 0.958 |
| 14.49847 | 0.958 |
| 14.52233 | 0.958 |
| 14.52331 | 0.958 |
| 14.54752 | 0.958 |
| 14.54843 | 0.958 |
| 14.54919 | 0.958 |
| 14.57318 | 0.917 |
| 14.57409 | 0.917 |
| 14.59935 | 0.917 |
| 14.60041 | 0.917 |
| 14.60122 | 0.917 |
| 14.62548 | 0.917 |
| 14.62674 | 0.917 |
| 14.62752 | 0.917 |
| 14.65276 | 0.917 |
| 14.65434 | 0.917 |
| 14.67964 | 0.917 |
| 14.68075 | 0.917 |
| 14.68151 | 0.917 |
| 14.70634 | 0.917 |
| 14.70759 | 0.917 |
| 14.70854 | 0.917 |
| 14.73315 | 0.917 |
| 14.75768 | 0.958 |
| 14.75863 | 0.958 |
| 14.7594 | 0.958 |
| 14.78397 | 0.958 |
| 14.78493 | 0.958 |
| 14.78569 | 0.958 |
| 14.81032 | 0.958 |
| 14.8113 | 0.958 |
| 14.87325 | 0.958 |
| 14.87413 | 0.958 |
| 14.8749 | 0.958 |
| 14.87582 | 1 |
| 14.87664 | 1 |
| 14.90174 | 1 |
| 14.90262 | 1 |
| 14.92832 | 1 |
| 14.92924 | 1 |
| 14.93003 | 1 |
| 14.95627 | 1.042 |
| 14.95736 | 1.042 |
| 14.95815 | 1.042 |
| 14.98325 | 1.042 |
| 14.98423 | 1.042 |
| 15.01006 | 1.042 |
| 15.01109 | 1.042 |
| 15.01187 | 1.042 |
| 15.03835 | 1.083 |
| 15.03922 | 1.083 |
| 15.04014 | 1.083 |
| 15.06787 | 1.083 |
| 15.06886 | 1.083 |
| 15.06968 | 1.083 |
| 15.09502 | 1.083 |
| 15.09598 | 1.083 |
| 15.12038 | 1.083 |
| 15.12135 | 1.083 |
| 15.12212 | 1.083 |
| 15.14655 | 1.125 |
| 15.14752 | 1.125 |
| 15.14829 | 1.125 |
| 15.1739 | 1.125 |
| 15.17477 | 1.125 |
| 15.20146 | 1.125 |
| 15.20245 | 1.125 |
| 15.20327 | 1.125 |
| 15.23013 | 1.125 |
| 15.2311 | 1.125 |
| 15.26718 | 1.083 |
| 15.26828 | 1.083 |
| 15.2691 | 1.083 |
| 15.26998 | 1.083 |
| 15.29612 | 1.083 |
| 15.29706 | 1.083 |
| 15.29783 | 1.083 |
| 15.32277 | 1.125 |
| 15.32383 | 1.083 |
| 15.3246 | 1.083 |
| 15.35128 | 1.083 |
| 15.35249 | 1.083 |
| 15.3774 | 1.083 |
| 15.37875 | 1.083 |
| 15.37959 | 1.083 |
| 15.40504 | 1.083 |
| 15.40597 | 1.083 |
| 15.40675 | 1.083 |
| 15.43156 | 1.042 |
| 15.43254 | 1.042 |
| 15.43348 | 1.042 |
| 15.45822 | 1.042 |
| 15.4592 | 1.042 |
| 15.48436 | 1.042 |
| 15.48538 | 1.042 |
| 15.51102 | 1.042 |
| 15.5119 | 1.042 |
| 15.5127 | 1.042 |
| 15.54246 | 1 |
| 15.54341 | 1 |
| 15.54419 | 1 |
| 15.56848 | 0.958 |
| 15.56958 | 0.958 |
| 15.57036 | 0.958 |
| 15.59521 | 0.958 |
| 15.59619 | 0.958 |
| 15.6202 | 0.958 |
| 15.62126 | 0.958 |
| 15.62205 | 0.958 |
| 15.64746 | 0.958 |
| 15.64845 | 0.958 |
| 15.64955 | 0.958 |
| 15.67509 | 0.958 |
| 15.67597 | 0.958 |
| 15.70187 | 0.917 |
| 15.70279 | 0.917 |
| 15.70358 | 0.917 |
| 15.72921 | 0.917 |
| 15.7302 | 0.917 |
| 15.75517 | 0.958 |
| 15.7561 | 0.958 |
| 15.7569 | 0.958 |
| 15.78291 | 0.917 |
| 15.78438 | 0.917 |
| 15.78517 | 0.917 |
| 15.80991 | 0.917 |
| 15.81093 | 0.917 |
| 15.81197 | 0.958 |
| 15.83747 | 0.917 |
| 15.83847 | 0.917 |
| 15.86545 | 0.958 |
| 15.8666 | 0.958 |
| 15.86782 | 0.958 |
| 15.8938 | 0.958 |
| 15.89471 | 0.958 |
| 15.89569 | 0.958 |
| 15.92177 | 0.958 |
| 15.92276 | 0.958 |
| 15.94963 | 0.958 |
| 15.95058 | 0.958 |
| 15.95163 | 0.958 |
| 15.97856 | 0.958 |
| 15.97952 | 0.958 |
| 15.9803 | 0.958 |
| 16.00591 | 1 |
| 16.00689 | 1 |
| 16.03341 | 1.042 |
| 16.03428 | 1.042 |
| 16.03559 | 1.042 |
| 16.06165 | 1.042 |
| 16.06265 | 1.042 |
| 16.06345 | 1.042 |
| 16.08959 | 1.042 |
| 16.09054 | 1.042 |
| 16.09136 | 1.042 |
| 16.11605 | 1.042 |
| 16.11693 | 1.042 |
| 16.14278 | 1.083 |
| 16.14381 | 1.083 |
| 16.14488 | 1.083 |
| 16.16991 | 1.083 |
| 16.17103 | 1.083 |
| 16.17183 | 1.083 |
| 16.19741 | 1.083 |
| 16.19842 | 1.083 |
| 16.19966 | 1.083 |
| 16.224 | 1.083 |
| 16.225 | 1.083 |
| 16.24937 | 1.125 |
| 16.25037 | 1.125 |
| 16.25144 | 1.083 |
| 16.27634 | 1.083 |
| 16.27743 | 1.083 |
| 16.30403 | 1.125 |
| 16.30504 | 1.125 |
| 16.30585 | 1.125 |
| 16.33276 | 1.125 |
| 16.33373 | 1.125 |
| 16.33452 | 1.125 |
| 16.3604 | 1.125 |
| 16.36144 | 1.125 |
| 16.38762 | 1.083 |
| 16.38864 | 1.083 |
| 16.38943 | 1.083 |
| 16.41691 | 1.125 |
| 16.41792 | 1.125 |
| 16.41872 | 1.125 |
| 16.44544 | 1.083 |
| 16.44648 | 1.083 |
| 16.44729 | 1.083 |
| 16.47503 | 1.083 |
| 16.47596 | 1.083 |
| 16.50055 | 1.083 |
| 16.50212 | 1.083 |
| 16.52686 | 1.042 |
| 16.52775 | 1.042 |
| 16.52857 | 1.042 |
| 16.55364 | 1.042 |
| 16.55465 | 1.042 |
| 16.55577 | 1.042 |
| 16.58053 | 1.042 |
| 16.58155 | 1.042 |
| 16.60681 | 1 |
| 16.60773 | 1 |
| 16.60874 | 1 |
| 16.63388 | 1.042 |
| 16.6349 | 1.042 |
| 16.63582 | 1 |
| 16.66519 | 1 |
| 16.66624 | 1 |
| 16.66991 | 1 |
| 16.69711 | 0.958 |
| 16.6981 | 0.958 |
| 16.72921 | 0.958 |
| 16.7302 | 0.958 |
| 16.73101 | 0.958 |
| 16.73191 | 0.958 |
| 16.76202 | 0.958 |
| 16.76295 | 0.958 |
| 16.76377 | 0.958 |
| 16.78979 | 0.958 |
| 16.79081 | 0.958 |
| 16.79179 | 0.917 |
| 16.81857 | 0.917 |
| 16.81954 | 0.917 |
| 16.84453 | 0.917 |
| 16.84571 | 0.917 |
| 16.84792 | 0.917 |
| 16.87498 | 0.917 |
| 16.87617 | 0.958 |
| 16.87698 | 0.958 |
| 16.9026 | 0.917 |
| 16.90353 | 0.917 |
| 16.90436 | 0.917 |
| 16.93035 | 0.958 |
| 16.93138 | 0.958 |
| 16.95679 | 0.917 |
| 16.95812 | 0.917 |
| 16.95894 | 0.917 |
| 16.98455 | 0.958 |
| 16.98571 | 0.958 |
| 16.9867 | 0.958 |
| 17.01213 | 0.958 |
| 17.01317 | 0.958 |
| 17.04258 | 0.958 |
| 17.04368 | 0.958 |
| 17.04451 | 0.958 |
| 17.04547 | 0.958 |
| 17.07399 | 0.958 |
| 17.07501 | 0.958 |
| 17.07874 | 0.958 |
| 17.10386 | 1 |
| 17.10496 | 1 |
| 17.10605 | 1 |
| 17.13934 | 1 |
| 17.14057 | 1 |
| 17.14181 | 1 |
| 17.16926 | 1.042 |
| 17.1703 | 1.042 |
| 17.17142 | 1.042 |
| 17.19925 | 1.042 |
| 17.20038 | 1.042 |
| 17.20126 | 1.042 |
| 17.20934 | 1.042 |
| 17.23474 | 1.042 |
| 17.23583 | 1.042 |
| 17.26337 | 1.083 |
| 17.26483 | 1.083 |
| 17.26583 | 1.083 |
| 17.29363 | 1.083 |
| 17.29593 | 1.083 |
| 17.29696 | 1.083 |
| 17.32296 | 1.083 |
| 17.32396 | 1.083 |
| 17.32477 | 1.083 |
| 17.35076 | 1.083 |
| 17.3518 | 1.083 |
| 17.35273 | 1.083 |
| 17.37837 | 1.125 |
| 17.38011 | 1.125 |
| 17.40588 | 1.125 |
| 17.407 | 1.125 |
| 17.40784 | 1.125 |
| 17.43462 | 1.125 |
| 17.43579 | 1.125 |
| 17.43662 | 1.125 |
| 17.46242 | 1.125 |
| 17.46352 | 1.125 |
| 17.46436 | 1.125 |
| 17.49504 | 1.083 |
| 17.49605 | 1.083 |
| 17.49687 | 1.083 |
| 17.52131 | 1.083 |
| 17.5223 | 1.083 |
| 17.52593 | 1.083 |
| 17.55063 | 1.083 |
| 17.55166 | 1.083 |
| 17.55885 | 1.083 |
| 17.58792 | 1.083 |
| 17.58904 | 1.083 |
| 17.5899 | 1.083 |
| 17.61769 | 1.083 |
| 17.61872 | 1.083 |
| 17.61962 | 1.042 |
| 17.64891 | 1.042 |
| 17.64994 | 1.042 |
| 17.65086 | 1.042 |
| 17.677 | 1.042 |
| 17.67804 | 1.042 |
| 17.6789 | 1.042 |
| 17.70693 | 1.042 |
| 17.70785 | 1.042 |
| 17.70889 | 1.042 |
| 17.73803 | 1 |
| 17.74031 | 1 |
| 17.74133 | 1 |
| 17.76703 | 1 |
| 17.76805 | 1 |
| 17.79307 | 0.958 |
| 17.79425 | 0.958 |
| 17.79509 | 0.958 |
| 17.81951 | 1 |
| 17.82055 | 1 |
| 17.88299 | 0.958 |
| 17.88396 | 0.958 |
| 17.885 | 0.958 |
| 17.88582 | 0.958 |
| 17.8867 | 0.958 |
| 17.88753 | 0.958 |
| 17.91254 | 0.917 |
| 17.91423 | 0.917 |
| 17.94013 | 0.958 |
| 17.94117 | 0.958 |
| 17.94202 | 0.958 |
| 17.96801 | 0.917 |
| 17.96905 | 0.917 |
| 17.97013 | 0.917 |
| 17.99639 | 0.917 |
| 17.99776 | 0.917 |
| 17.99861 | 0.917 |
| 18.02551 | 0.958 |
| 18.02657 | 0.958 |
| 18.0274 | 0.958 |
| 18.05396 | 0.917 |
| 18.05514 | 0.917 |
| 18.0815 | 0.917 |
| 18.08248 | 0.917 |
| 18.08342 | 0.917 |
| 18.11959 | 0.958 |
| 18.12066 | 0.958 |
| 18.12154 | 0.958 |
| 18.1224 | 0.958 |
| 18.15042 | 0.958 |
| 18.15148 | 0.958 |
| 18.15262 | 0.958 |
| 18.17921 | 0.958 |
| 18.18021 | 0.958 |
| 18.18132 | 0.958 |
| 18.20695 | 1 |
| 18.20797 | 1 |
| 18.20895 | 1 |
| 18.2342 | 1 |
| 18.2358 | 1 |
| 18.26215 | 1 |
| 18.26359 | 1 |
| 18.26446 | 1 |
| 18.29088 | 1 |
| 18.29189 | 1 |
| 18.31908 | 1.042 |
| 18.32012 | 1.042 |
| 18.321 | 1.042 |
| 18.3464 | 1.042 |
| 18.34739 | 1.042 |
| 18.34824 | 1.042 |
| 18.37311 | 1.083 |
| 18.37406 | 1.083 |
| 18.40479 | 1.083 |
| 18.40577 | 1.083 |
| 18.40662 | 1.083 |
| 18.43318 | 1.083 |
| 18.43424 | 1.083 |
| 18.43515 | 1.083 |
| 18.43599 | 1.083 |
| 18.4609 | 1.083 |
| 18.46198 | 1.083 |
| 18.48694 | 1.083 |
| 18.48802 | 1.083 |
| 18.51423 | 1.125 |
| 18.51537 | 1.083 |
| 18.51623 | 1.083 |
| 18.51707 | 1.083 |
| 18.55771 | 1.083 |
| 18.5589 | 1.083 |
| 18.55995 | 1.083 |
| 18.56085 | 1.083 |
| 18.58531 | 1.125 |
| 18.58637 | 1.125 |
| 18.61513 | 1.083 |
| 18.61617 | 1.083 |
| 18.61701 | 1.083 |
| 18.64158 | 1.083 |
| 18.64267 | 1.083 |
| 18.64354 | 1.083 |
| 18.66972 | 1.083 |
| 18.67076 | 1.083 |
| 18.67489 | 1.083 |
| 18.7022 | 1.083 |
| 18.73005 | 1.042 |
| 18.73113 | 1.042 |
| 18.73197 | 1.042 |
| 18.73284 | 1.042 |
| 18.76147 | 1.042 |
| 18.76252 | 1.042 |
| 18.76346 | 1.042 |
| 18.79175 | 1.042 |
| 18.79276 | 1.042 |
| 18.79361 | 1.042 |
| 18.82651 | 1 |
| 18.82762 | 1 |
| 18.82847 | 1 |
| 18.83081 | 1 |
| 18.86649 | 1 |
| 18.86757 | 1 |
| 18.86854 | 1 |
| 18.89505 | 1 |
| 18.89612 | 1 |
| 18.89696 | 1 |
| 18.92258 | 0.958 |
| 18.9237 | 0.958 |
| 18.92481 | 0.958 |
| 18.95165 | 0.958 |
| 18.95263 | 0.958 |
| 18.97896 | 0.958 |
| 18.98 | 0.958 |
| 18.98102 | 0.958 |
| 19.00884 | 0.958 |
| 19.01001 | 0.958 |
| 19.01092 | 0.958 |
| 19.03863 | 0.958 |
| 19.03971 | 0.958 |
| 19.04057 | 0.958 |
| 19.04654 | 0.917 |
| 19.07316 | 0.917 |
| 19.07425 | 0.917 |
| 19.10311 | 0.958 |
| 19.10415 | 0.958 |
| 19.10501 | 0.958 |
| 19.11113 | 0.917 |
| 19.13617 | 0.917 |
| 19.13717 | 0.917 |
| 19.16453 | 0.958 |
| 19.16557 | 0.958 |
| 19.16649 | 0.958 |
| 19.19143 | 0.958 |
| 19.19253 | 0.958 |
| 19.19342 | 0.958 |
| 19.21904 | 0.958 |
| 19.22013 | 0.958 |
| 19.22117 | 0.958 |
| 19.2469 | 0.958 |
| 19.24786 | 0.958 |
| 19.2783 | 0.958 |
| 19.27944 | 0.958 |
| 19.28035 | 0.958 |
| 19.28254 | 0.958 |
| 19.30877 | 0.958 |
| 19.31004 | 0.958 |
| 19.33535 | 1 |
| 19.33641 | 1 |
| 19.33727 | 1 |
| 19.36259 | 1 |
| 19.36383 | 1 |
| 19.36526 | 1 |
| 19.39151 | 1 |
| 19.39258 | 1 |
| 19.41879 | 1.042 |
| 19.42019 | 1.042 |
| 19.42109 | 1.042 |
| 19.45013 | 1.042 |
| 19.45125 | 1.042 |
| 19.45211 | 1.042 |
| 19.46671 | 1.042 |
| 19.47038 | 1.042 |
| 19.49578 | 1.042 |
| 19.49686 | 1.042 |
| 19.49776 | 1.042 |
| 19.52522 | 1.042 |
| 19.52643 | 1.083 |
| 19.5273 | 1.083 |
| 19.55687 | 1.083 |
| 19.55797 | 1.083 |
| 19.55884 | 1.083 |
| 19.58491 | 1.083 |
| 19.586 | 1.083 |
| 19.6127 | 1.083 |
| 19.61378 | 1.083 |
| 19.61465 | 1.083 |
| 19.63948 | 1.083 |
| 19.64056 | 1.083 |
| 19.64168 | 1.083 |
| 19.66809 | 1.083 |
| 19.66908 | 1.083 |
| 19.6947 | 1.083 |
| 19.69578 | 1.083 |
| 19.69668 | 1.083 |
| 19.72163 | 1.083 |
| 19.72274 | 1.083 |
| 19.7239 | 1.083 |
| 19.75021 | 1.083 |
| 19.75134 | 1.083 |
| 19.75223 | 1.083 |
| 19.7825 | 1.083 |
| 19.78348 | 1.083 |
| 19.78437 | 1.083 |
| 19.81056 | 1.083 |
| 19.81167 | 1.083 |
| 19.83752 | 1.083 |
| 19.83858 | 1.083 |
| 19.8395 | 1.083 |
| 19.86504 | 1.042 |
| 19.86619 | 1.042 |
| 19.86707 | 1.042 |